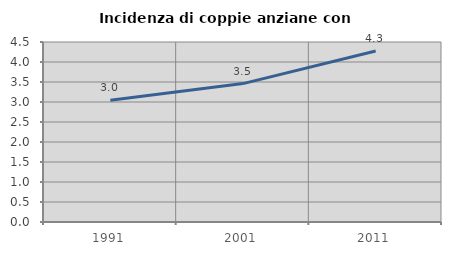
| Category | Incidenza di coppie anziane con figli |
|---|---|
| 1991.0 | 3.042 |
| 2001.0 | 3.46 |
| 2011.0 | 4.273 |